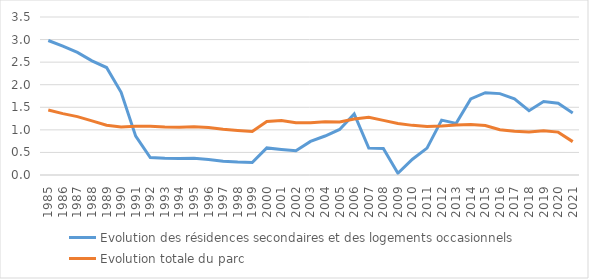
| Category | Evolution des résidences secondaires et des logements occasionnels | Evolution totale du parc |
|---|---|---|
| 1985.0 | 2.979 | 1.441 |
| 1986.0 | 2.854 | 1.359 |
| 1987.0 | 2.717 | 1.293 |
| 1988.0 | 2.53 | 1.199 |
| 1989.0 | 2.381 | 1.104 |
| 1990.0 | 1.833 | 1.065 |
| 1991.0 | 0.86 | 1.079 |
| 1992.0 | 0.385 | 1.078 |
| 1993.0 | 0.37 | 1.063 |
| 1994.0 | 0.366 | 1.059 |
| 1995.0 | 0.369 | 1.07 |
| 1996.0 | 0.343 | 1.052 |
| 1997.0 | 0.307 | 1.015 |
| 1998.0 | 0.287 | 0.987 |
| 1999.0 | 0.277 | 0.963 |
| 2000.0 | 0.6 | 1.187 |
| 2001.0 | 0.567 | 1.209 |
| 2002.0 | 0.536 | 1.158 |
| 2003.0 | 0.744 | 1.157 |
| 2004.0 | 0.864 | 1.179 |
| 2005.0 | 1.009 | 1.174 |
| 2006.0 | 1.352 | 1.24 |
| 2007.0 | 0.599 | 1.276 |
| 2008.0 | 0.586 | 1.211 |
| 2009.0 | 0.039 | 1.142 |
| 2010.0 | 0.349 | 1.099 |
| 2011.0 | 0.595 | 1.076 |
| 2012.0 | 1.215 | 1.086 |
| 2013.0 | 1.144 | 1.109 |
| 2014.0 | 1.685 | 1.119 |
| 2015.0 | 1.824 | 1.097 |
| 2016.0 | 1.803 | 1.003 |
| 2017.0 | 1.687 | 0.97 |
| 2018.0 | 1.425 | 0.95 |
| 2019.0 | 1.627 | 0.981 |
| 2020.0 | 1.589 | 0.95 |
| 2021.0 | 1.375 | 0.739 |